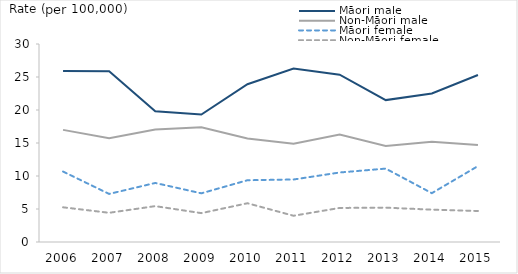
| Category | Māori male | Non-Māori male | Māori female | Non-Māori female |
|---|---|---|---|---|
| 2006.0 | 25.898 | 16.987 | 10.67 | 5.258 |
| 2007.0 | 25.874 | 15.733 | 7.284 | 4.425 |
| 2008.0 | 19.797 | 17.038 | 8.945 | 5.436 |
| 2009.0 | 19.312 | 17.374 | 7.377 | 4.374 |
| 2010.0 | 23.898 | 15.69 | 9.359 | 5.872 |
| 2011.0 | 26.277 | 14.9 | 9.47 | 3.976 |
| 2012.0 | 25.349 | 16.274 | 10.53 | 5.161 |
| 2013.0 | 21.502 | 14.538 | 11.121 | 5.205 |
| 2014.0 | 22.5 | 15.2 | 7.4 | 4.9 |
| 2015.0 | 25.3 | 14.7 | 11.5 | 4.7 |